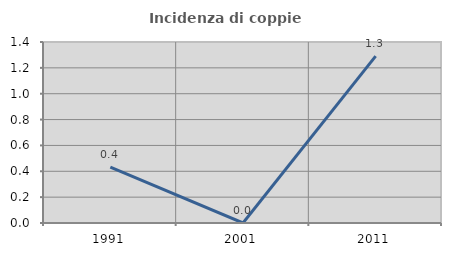
| Category | Incidenza di coppie miste |
|---|---|
| 1991.0 | 0.432 |
| 2001.0 | 0 |
| 2011.0 | 1.29 |